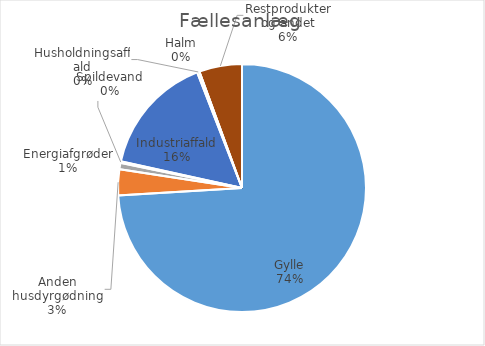
| Category | Series 0 |
|---|---|
| Gylle | 3333041.192 |
| Anden husdyrgødning | 152278.46 |
| Energiafgrøder | 37061 |
| Spildevand | 8901.08 |
| Industriaffald | 705013.525 |
| Husholdningsaffald | 13486.21 |
| Halm | 159 |
| Restprodukter og andet | 251495.84 |